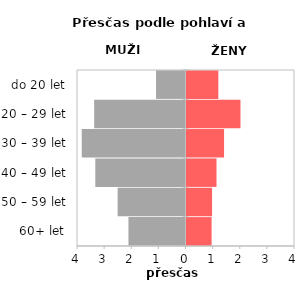
| Category | Přesčas |
|---|---|
| 60+ let | 0.925 |
| 50 – 59 let | 0.942 |
| 40 – 49 let | 1.106 |
| 30 – 39 let | 1.385 |
| 20 – 29 let | 1.99 |
| do 20 let | 1.173 |